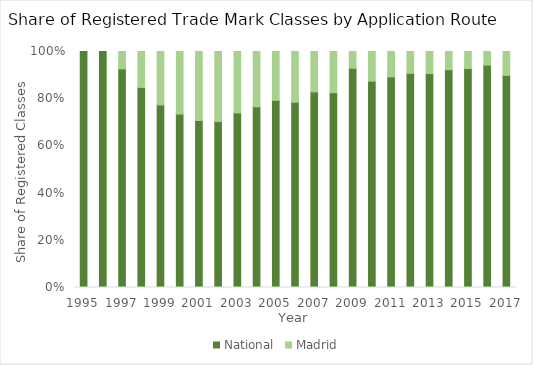
| Category | National | Madrid |
|---|---|---|
| 1995.0 | 1 | 0 |
| 1996.0 | 1 | 0 |
| 1997.0 | 0.926 | 0.074 |
| 1998.0 | 0.848 | 0.152 |
| 1999.0 | 0.774 | 0.226 |
| 2000.0 | 0.735 | 0.265 |
| 2001.0 | 0.708 | 0.292 |
| 2002.0 | 0.703 | 0.297 |
| 2003.0 | 0.74 | 0.26 |
| 2004.0 | 0.766 | 0.234 |
| 2005.0 | 0.793 | 0.207 |
| 2006.0 | 0.785 | 0.215 |
| 2007.0 | 0.829 | 0.171 |
| 2008.0 | 0.825 | 0.175 |
| 2009.0 | 0.929 | 0.071 |
| 2010.0 | 0.874 | 0.126 |
| 2011.0 | 0.892 | 0.108 |
| 2012.0 | 0.907 | 0.093 |
| 2013.0 | 0.906 | 0.094 |
| 2014.0 | 0.923 | 0.077 |
| 2015.0 | 0.928 | 0.072 |
| 2016.0 | 0.943 | 0.057 |
| 2017.0 | 0.899 | 0.101 |